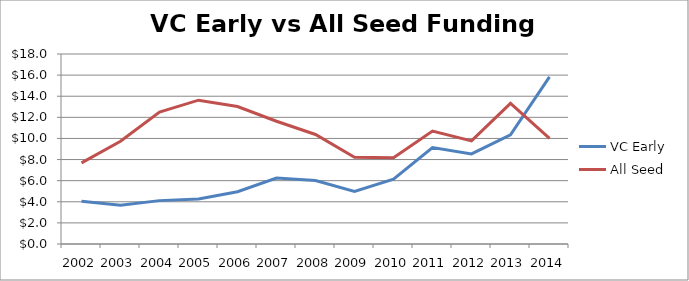
| Category | VC Early  | All Seed |
|---|---|---|
| 2002.0 | 4.042 | 7.686 |
| 2003.0 | 3.666 | 9.739 |
| 2004.0 | 4.109 | 12.498 |
| 2005.0 | 4.254 | 13.626 |
| 2006.0 | 4.949 | 13.024 |
| 2007.0 | 6.243 | 11.632 |
| 2008.0 | 6.021 | 10.377 |
| 2009.0 | 4.969 | 8.211 |
| 2010.0 | 6.136 | 8.164 |
| 2011.0 | 9.141 | 10.693 |
| 2012.0 | 8.53 | 9.762 |
| 2013.0 | 10.345 | 13.325 |
| 2014.0 | 15.825 | 10 |